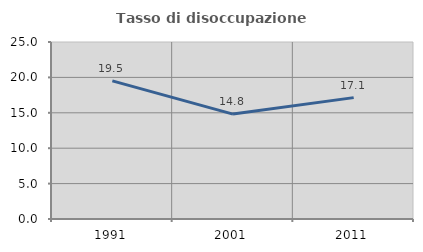
| Category | Tasso di disoccupazione giovanile  |
|---|---|
| 1991.0 | 19.512 |
| 2001.0 | 14.815 |
| 2011.0 | 17.143 |